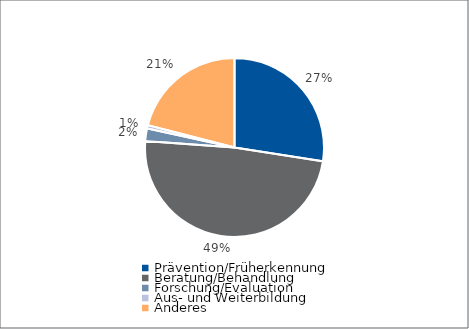
| Category | Series 0 |
|---|---|
| Prävention/Früherkennung | 155652 |
| Beratung/Behandlung | 275719 |
| Forschung/Evaluation | 12971 |
| Aus- und Weiterbildung | 3364 |
| Anderes | 118866 |